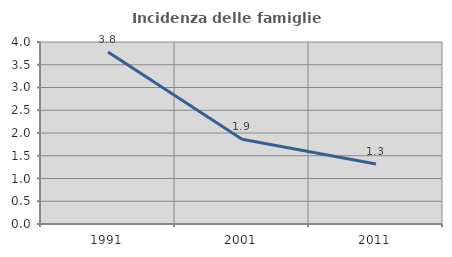
| Category | Incidenza delle famiglie numerose |
|---|---|
| 1991.0 | 3.779 |
| 2001.0 | 1.862 |
| 2011.0 | 1.32 |